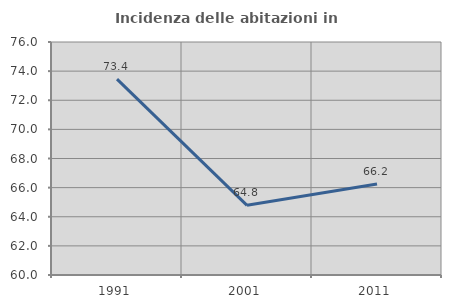
| Category | Incidenza delle abitazioni in proprietà  |
|---|---|
| 1991.0 | 73.446 |
| 2001.0 | 64.783 |
| 2011.0 | 66.245 |